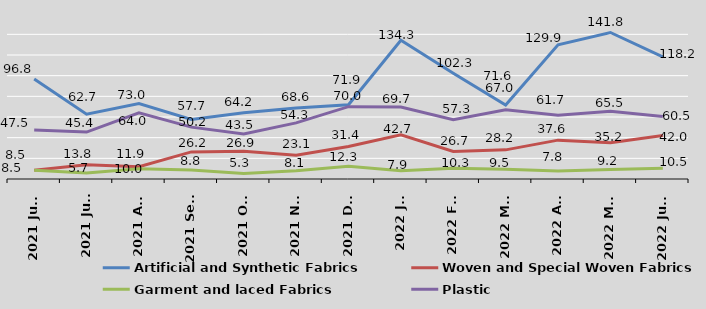
| Category | Artificial and Synthetic Fabrics | Woven and Special Woven Fabrics  | Garment and laced Fabrics | Plastic |
|---|---|---|---|---|
| 2021 June | 96.8 | 8.5 | 8.5 | 47.5 |
| 2021 July | 62.7 | 13.8 | 5.7 | 45.4 |
| 2021 Aug | 73 | 11.9 | 10 | 64 |
| 2021 Sept | 57.7 | 26.2 | 8.8 | 50.2 |
| 2021 Oct | 64.2 | 26.9 | 5.3 | 43.5 |
| 2021 Nov | 68.6 | 23.1 | 8.1 | 54.3 |
| 2021 Dec | 71.9 | 31.4 | 12.3 | 70 |
| 2022 Jan | 134.3 | 42.7 | 7.9 | 69.7 |
| 2022 Feb | 102.3 | 26.7 | 10.3 | 57.3 |
| 2022 Mar | 71.6 | 28.2 | 9.5 | 67 |
| 2022 Apr | 129.9 | 37.6 | 7.8 | 61.7 |
| 2022 May | 141.8 | 35.2 | 9.2 | 65.5 |
| 2022 June | 118.2 | 42 | 10.5 | 60.5 |